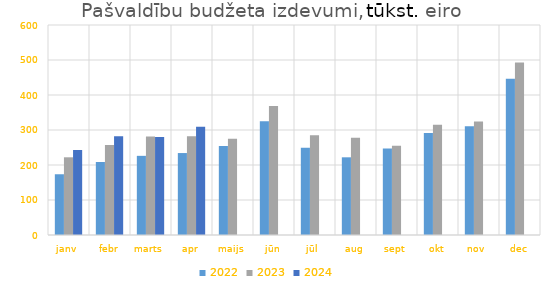
| Category | 2022 | 2023 | 2024 |
|---|---|---|---|
| janv | 173548.423 | 221986.169 | 243159.273 |
| febr | 208650.357 | 257310.25 | 282000.26 |
| marts | 226166.321 | 281685.717 | 280186.85 |
| apr | 234145.666 | 282101.213 | 309610.596 |
| maijs | 253995.943 | 274959.68 | 0 |
| jūn | 325201.018 | 368738.502 | 0 |
| jūl | 249623.438 | 285193.851 | 0 |
| aug | 221979.814 | 277676.465 | 0 |
| sept | 247335.901 | 255025.415 | 0 |
| okt | 291387.208 | 315119.239 | 0 |
| nov | 310697.322 | 324385.045 | 0 |
| dec | 446706.592 | 492764.721 | 0 |